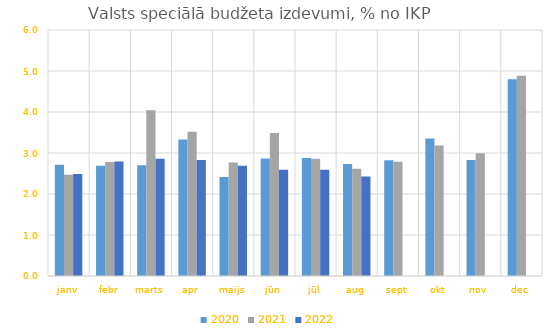
| Category | 2020 | 2021 | 2022 |
|---|---|---|---|
| janv | 2.713 | 2.472 | 2.488 |
| febr | 2.689 | 2.779 | 2.791 |
| marts | 2.701 | 4.044 | 2.857 |
| apr | 3.327 | 3.52 | 2.828 |
| maijs | 2.412 | 2.768 | 2.691 |
| jūn | 2.868 | 3.489 | 2.591 |
| jūl | 2.876 | 2.858 | 2.593 |
| aug | 2.731 | 2.619 | 2.424 |
| sept | 2.821 | 2.787 | 0 |
| okt | 3.357 | 3.182 | 0 |
| nov | 2.827 | 2.997 | 0 |
| dec | 4.801 | 4.883 | 0 |